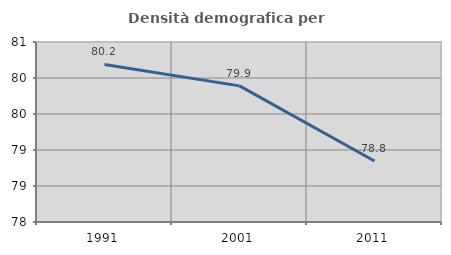
| Category | Densità demografica |
|---|---|
| 1991.0 | 80.189 |
| 2001.0 | 79.891 |
| 2011.0 | 78.848 |